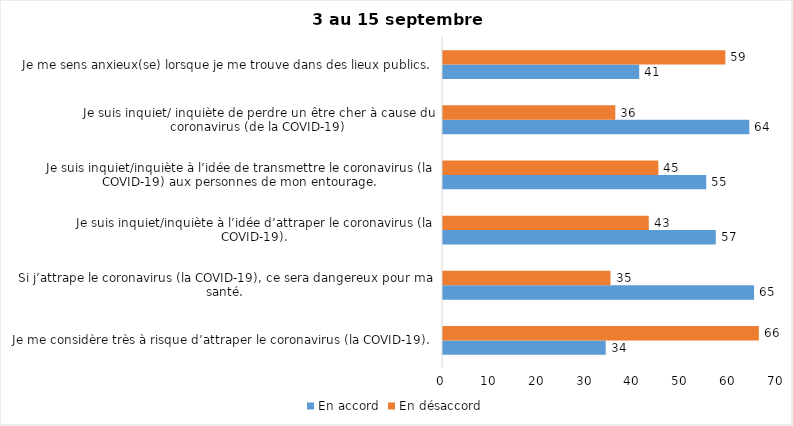
| Category | En accord | En désaccord |
|---|---|---|
| Je me considère très à risque d’attraper le coronavirus (la COVID-19). | 34 | 66 |
| Si j’attrape le coronavirus (la COVID-19), ce sera dangereux pour ma santé. | 65 | 35 |
| Je suis inquiet/inquiète à l’idée d’attraper le coronavirus (la COVID-19). | 57 | 43 |
| Je suis inquiet/inquiète à l’idée de transmettre le coronavirus (la COVID-19) aux personnes de mon entourage. | 55 | 45 |
| Je suis inquiet/ inquiète de perdre un être cher à cause du coronavirus (de la COVID-19) | 64 | 36 |
| Je me sens anxieux(se) lorsque je me trouve dans des lieux publics. | 41 | 59 |